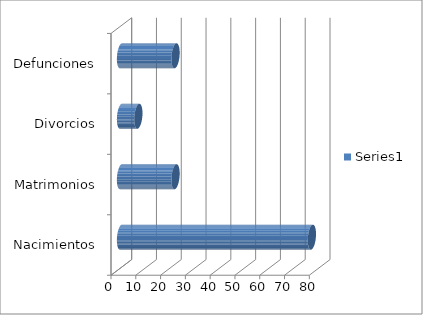
| Category | Series 0 |
|---|---|
| Nacimientos | 77 |
| Matrimonios | 22 |
| Divorcios | 7 |
| Defunciones | 22 |